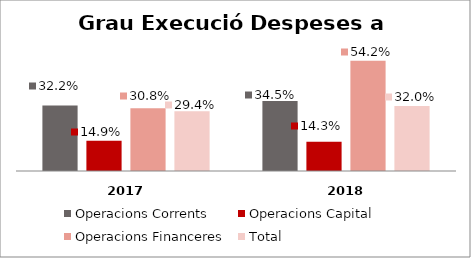
| Category | Operacions Corrents | Operacions Capital | Operacions Financeres | Total |
|---|---|---|---|---|
| 0 | 0.322 | 0.149 | 0.308 | 0.294 |
| 1 | 0.345 | 0.143 | 0.542 | 0.32 |